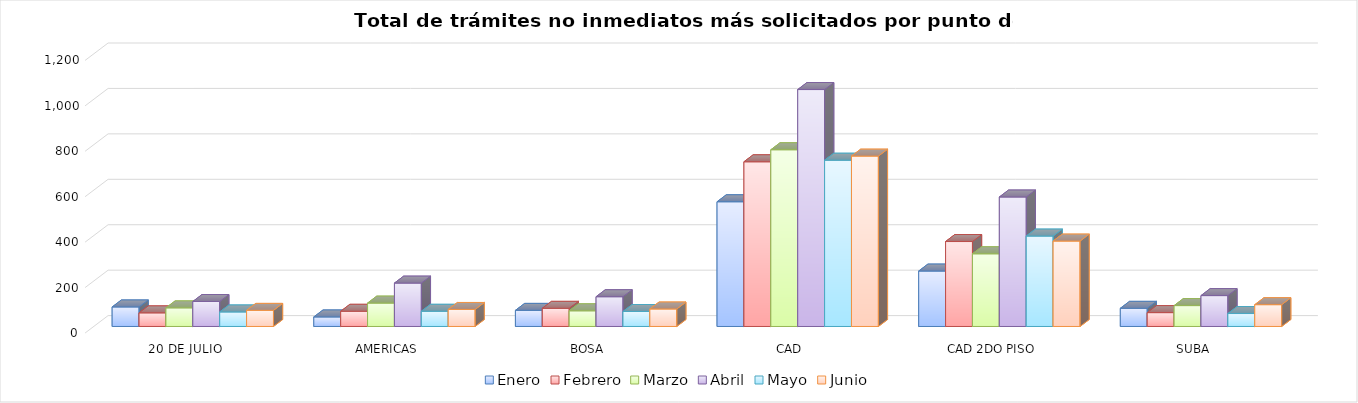
| Category | Enero | Febrero | Marzo | Abril | Mayo | Junio |
|---|---|---|---|---|---|---|
| 20 DE JULIO | 86 | 60 | 82 | 110 | 64 | 71 |
| AMERICAS | 42 | 67 | 103 | 191 | 67 | 75 |
| BOSA | 71 | 80 | 69 | 131 | 66 | 77 |
| CAD | 549 | 725 | 778 | 1043 | 732 | 750 |
| CAD 2DO PISO | 244 | 374 | 320 | 570 | 398 | 376 |
| SUBA | 80 | 61 | 92 | 136 | 57 | 96 |